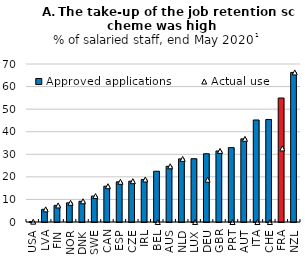
| Category | Approved applications |
|---|---|
| USA | 0.143 |
| LVA | 5.614 |
| FIN | 7.35 |
| NOR | 8.497 |
| DNK | 9.186 |
| SWE | 11.483 |
| CAN | 15.857 |
| ESP | 17.806 |
| CZE | 18.094 |
| IRL | 18.83 |
| BEL | 22.494 |
| AUS | 24.691 |
| NLD | 27.965 |
| LUX | 28.034 |
| DEU | 30.236 |
| GBR | 31.466 |
| PRT | 32.95 |
| AUT | 36.839 |
| ITA | 45.204 |
| CHE | 45.432 |
| FRA | 54.931 |
| NZL | 66.273 |